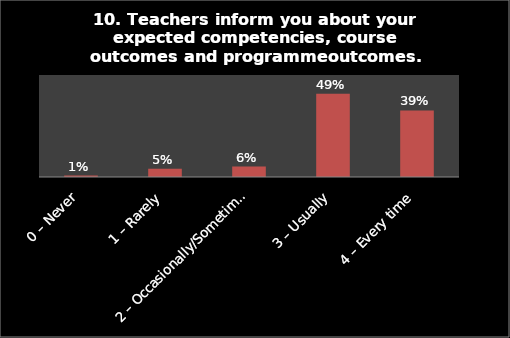
| Category | Series 0 |
|---|---|
| 0 – Never | 0.008 |
| 1 – Rarely | 0.049 |
| 2 – Occasionally/Sometimes | 0.061 |
| 3 – Usually | 0.49 |
| 4 – Every time | 0.391 |